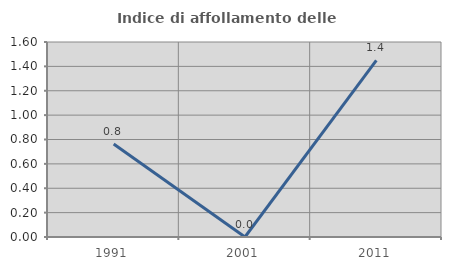
| Category | Indice di affollamento delle abitazioni  |
|---|---|
| 1991.0 | 0.763 |
| 2001.0 | 0 |
| 2011.0 | 1.449 |